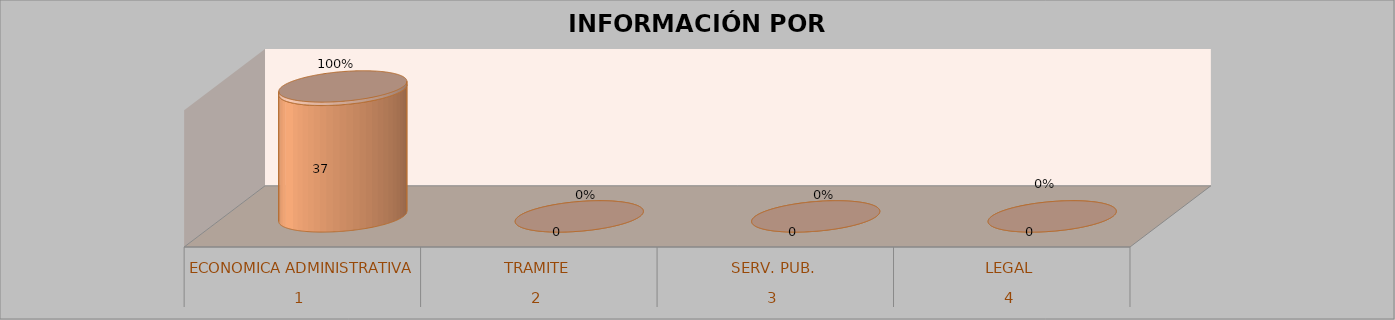
| Category | Series 0 | Series 1 | Series 2 | Series 3 |
|---|---|---|---|---|
| 0 |  |  | 37 | 1 |
| 1 |  |  | 0 | 0 |
| 2 |  |  | 0 | 0 |
| 3 |  |  | 0 | 0 |